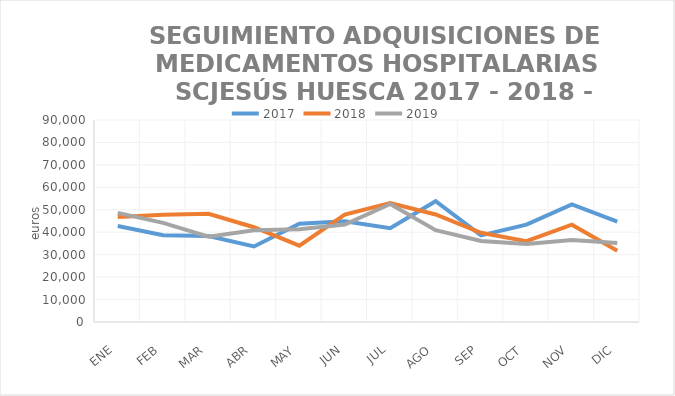
| Category | 2017 | 2018 | 2019 |
|---|---|---|---|
| ENE | 42754.41 | 46788.27 | 48628.19 |
| FEB | 38628.03 | 47775.4 | 44185.22 |
| MAR | 38295.9 | 48213.77 | 38018.76 |
| ABR | 33661.45 | 42208.94 | 40835 |
| MAY | 43811.42 | 34011.34 | 41314.22 |
| JUN | 44915.58 | 47889.32 | 43455.08 |
| JUL | 41763.98 | 52988.95 | 52607.83 |
| AGO | 53834.81 | 47896.99 | 40891.14 |
| SEP | 38565.21 | 39764.48 | 36093.68 |
| OCT | 43358.64 | 36028.51 | 34802.3 |
| NOV | 52429.42 | 43368.66 | 36505.9 |
| DIC | 44766.03 | 31778.36 | 35186.83 |